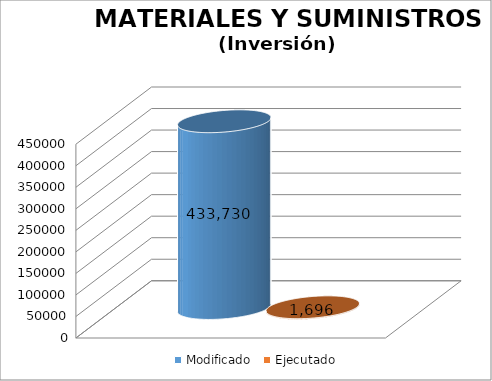
| Category | Modificado | Ejecutado |
|---|---|---|
| 0 | 433730 | 1696.32 |